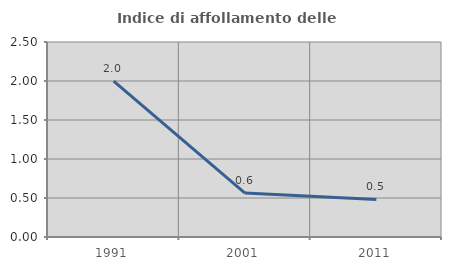
| Category | Indice di affollamento delle abitazioni  |
|---|---|
| 1991.0 | 1.999 |
| 2001.0 | 0.563 |
| 2011.0 | 0.481 |